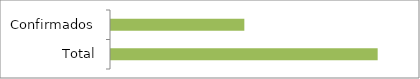
| Category | Series 0 |
|---|---|
| Total | 8 |
| Confirmados | 4 |